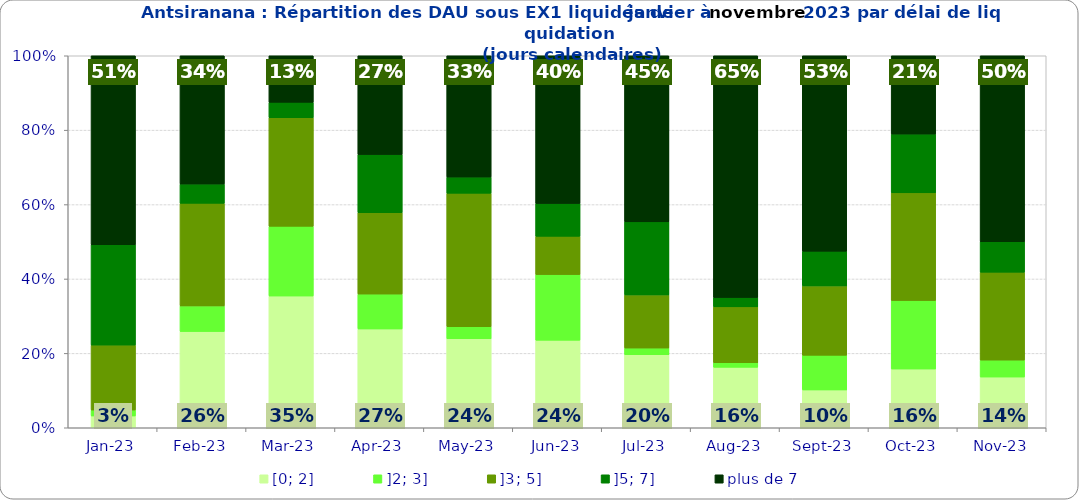
| Category | [0; 2] | ]2; 3] | ]3; 5] | ]5; 7] | plus de 7 |
|---|---|---|---|---|---|
| 2023-01-01 | 0.032 | 0.016 | 0.175 | 0.27 | 0.508 |
| 2023-02-01 | 0.259 | 0.069 | 0.276 | 0.052 | 0.345 |
| 2023-03-01 | 0.354 | 0.188 | 0.292 | 0.042 | 0.125 |
| 2023-04-01 | 0.266 | 0.094 | 0.219 | 0.156 | 0.266 |
| 2023-05-01 | 0.239 | 0.033 | 0.359 | 0.043 | 0.326 |
| 2023-06-01 | 0.235 | 0.176 | 0.103 | 0.088 | 0.397 |
| 2023-07-01 | 0.196 | 0.018 | 0.143 | 0.196 | 0.446 |
| 2023-08-01 | 0.162 | 0.012 | 0.15 | 0.025 | 0.65 |
| 2023-09-01 | 0.102 | 0.093 | 0.186 | 0.093 | 0.525 |
| 2023-10-01 | 0.158 | 0.184 | 0.289 | 0.158 | 0.211 |
| 2023-11-01 | 0.136 | 0.045 | 0.236 | 0.082 | 0.5 |